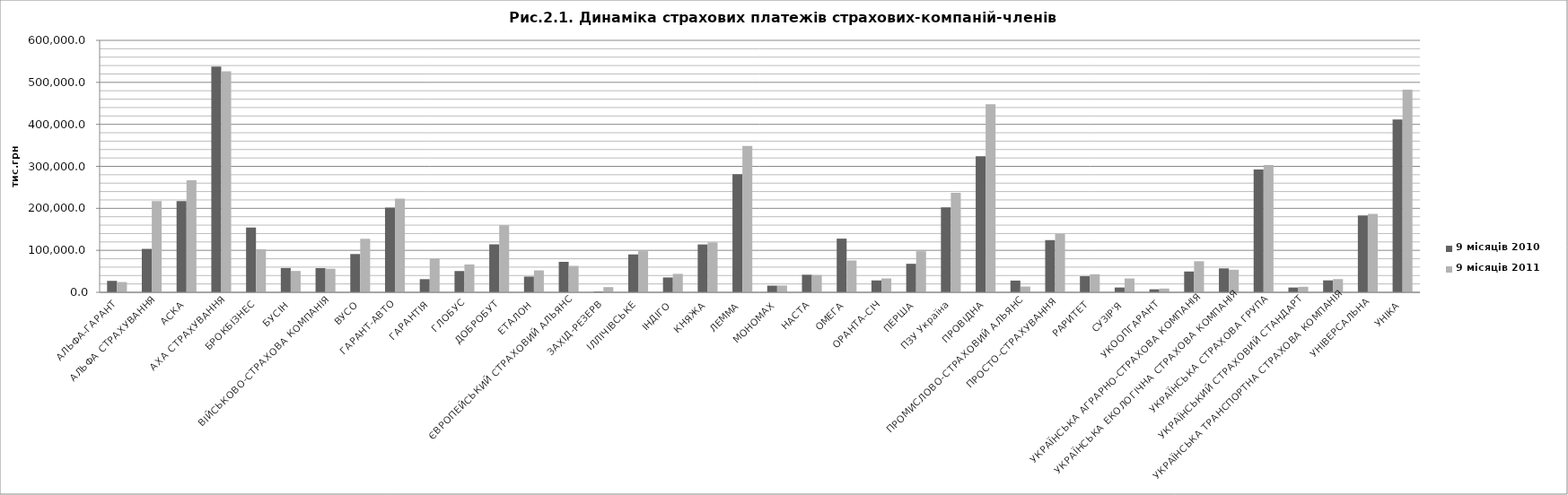
| Category | 9 місяців 2010 | 9 місяців 2011 |
|---|---|---|
| АЛЬФА-ГАРАНТ | 27309.8 | 24517 |
| АЛЬФА СТРАХУВАННЯ | 103448.3 | 217087.7 |
| АСКА | 217223.6 | 266994 |
| АХА СТРАХУВАННЯ | 537683 | 526069 |
| БРОКБІЗНЕС | 154306.9 | 102616.6 |
| БУСІН | 57949.9 | 50915.4 |
| ВІЙСЬКОВО-СТРАХОВА КОМПАНІЯ | 57674 | 56208.3 |
| ВУСО | 91200 | 127426.8 |
| ГАРАНТ-АВТО | 201916.8 | 222870.9 |
| ГАРАНТІЯ | 31355.6 | 80384.9 |
| ГЛОБУС | 50710.2 | 66342 |
| ДОБРОБУТ | 114308.8 | 159729.1 |
| ЕТАЛОН | 37542 | 52322.4 |
| ЄВРОПЕЙСЬКИЙ СТРАХОВИЙ АЛЬЯНС | 72658.8 | 63025 |
| ЗАХІД-РЕЗЕРВ | 1839 | 12474.1 |
| ІЛЛІЧІВСЬКЕ | 90284.1 | 98028.4 |
| ІНДІГО | 35463.4 | 43982.1 |
| КНЯЖА | 114013 | 119006 |
| ЛЕММА | 281053.6 | 348800.3 |
| МОНОМАХ | 15944 | 16253.1 |
| НАСТА | 41860 | 41322.6 |
| ОМЕГА | 127840.2 | 75879.8 |
| ОРАНТА-СІЧ | 28378.3 | 33080.8 |
| ПЕРША | 68001 | 97889 |
| ПЗУ Україна | 202397 | 237174.8 |
| ПРОВІДНА | 324193.4 | 447700.9 |
| ПРОМИСЛОВО-СТРАХОВИЙ АЛЬЯНС | 27959 | 13784.9 |
| ПРОСТО-СТРАХУВАННЯ | 124336.8 | 139199.9 |
| РАРИТЕТ | 38354 | 43066.6 |
| СУЗІР'Я | 11525 | 33006.1 |
| УКООПГАРАНТ | 7229 | 9016.9 |
| УКРАЇНСЬКА АГРАРНО-СТРАХОВА КОМПАНІЯ | 49617.5 | 74049.1 |
| УКРАЇНСЬКА ЕКОЛОГІЧНА СТРАХОВА КОМПАНІЯ | 56960.3 | 53861.1 |
| УКРАЇНСЬКА СТРАХОВА ГРУПА | 292594.3 | 303042.8 |
| УКРАЇНСЬКИЙ СТРАХОВИЙ СТАНДАРТ | 11484.5 | 13218.8 |
| УКРАЇНСЬКА ТРАНСПОРТНА СТРАХОВА КОМПАНІЯ | 28497.7 | 31469.8 |
| УНІВЕРСАЛЬНА | 183231 | 187070.9 |
| УНІКА | 411669.5 | 482600 |